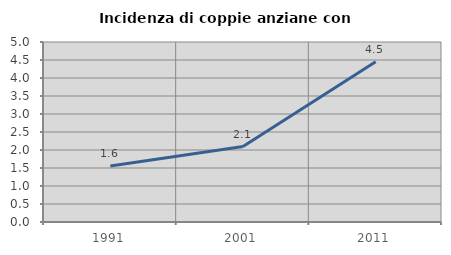
| Category | Incidenza di coppie anziane con figli |
|---|---|
| 1991.0 | 1.558 |
| 2001.0 | 2.094 |
| 2011.0 | 4.452 |